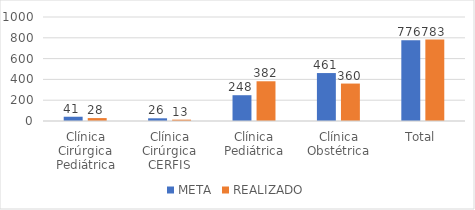
| Category | META | REALIZADO |
|---|---|---|
| Clínica Cirúrgica Pediátrica | 41 | 28 |
| Clínica Cirúrgica CERFIS | 26 | 13 |
| Clínica Pediátrica | 248 | 382 |
| Clínica Obstétrica | 461 | 360 |
| Total | 776 | 783 |